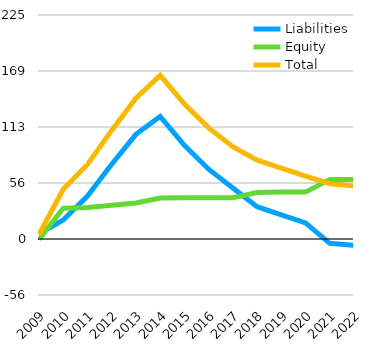
| Category | Liabilities  | Equity  | Total  |
|---|---|---|---|
| 2009 | 5.071 | -0.5 | 4.571 |
| 2010 | 19.143 | 30.857 | 50 |
| 2011 | 43.143 | 31.757 | 74.9 |
| 2012 | 75.143 | 33.957 | 109.1 |
| 2013 | 105.143 | 36.207 | 141.35 |
| 2014 | 123.143 | 41.207 | 164.35 |
| 2015 | 94.143 | 41.507 | 135.65 |
| 2016 | 70.143 | 41.507 | 111.65 |
| 2017 | 51.143 | 41.507 | 92.65 |
| 2018 | 32.443 | 46.707 | 79.15 |
| 2019 | 24.143 | 47.107 | 71.25 |
| 2020 | 16.143 | 47.107 | 63.25 |
| 2021 | -4.357 | 59.857 | 55.5 |
| 2022 | -6.457 | 59.857 | 53.4 |